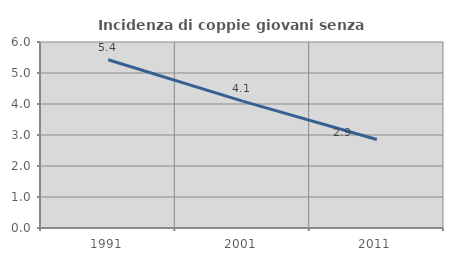
| Category | Incidenza di coppie giovani senza figli |
|---|---|
| 1991.0 | 5.429 |
| 2001.0 | 4.092 |
| 2011.0 | 2.853 |